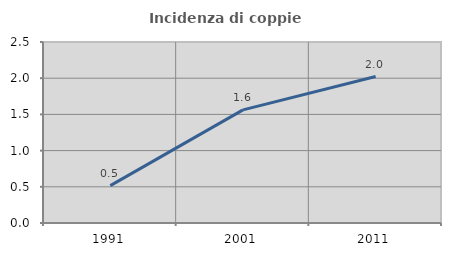
| Category | Incidenza di coppie miste |
|---|---|
| 1991.0 | 0.516 |
| 2001.0 | 1.562 |
| 2011.0 | 2.023 |